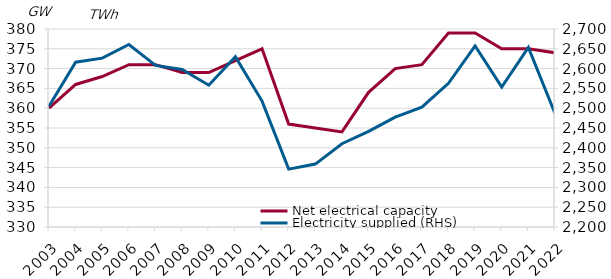
| Category | Net electrical capacity |
|---|---|
| 2003.0 | 360 |
| 2004.0 | 366 |
| 2005.0 | 368 |
| 2006.0 | 371 |
| 2007.0 | 371 |
| 2008.0 | 369 |
| 2009.0 | 369 |
| 2010.0 | 372 |
| 2011.0 | 375 |
| 2012.0 | 356 |
| 2013.0 | 355 |
| 2014.0 | 354 |
| 2015.0 | 364 |
| 2016.0 | 370 |
| 2017.0 | 371 |
| 2018.0 | 379 |
| 2019.0 | 379 |
| 2020.0 | 375 |
| 2021.0 | 375 |
| 2022.0 | 374 |